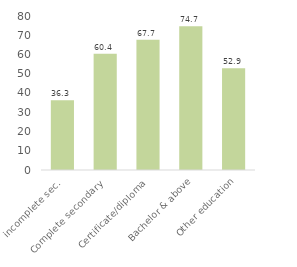
| Category | Series 0 |
|---|---|
| incomplete sec. | 36.27 |
| Complete secondary | 60.366 |
| Certificate/diploma | 67.663 |
| Bachelor & above | 74.721 |
| Other education | 52.869 |